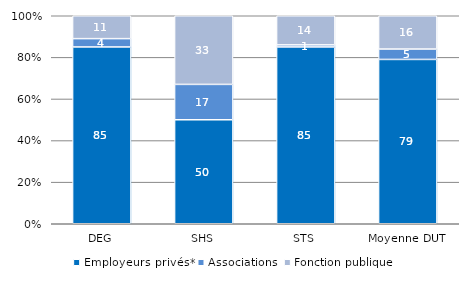
| Category | Employeurs privés* | Associations | Fonction publique |
|---|---|---|---|
| DEG | 85 | 4 | 11 |
| SHS | 50 | 17 | 33 |
| STS | 85 | 1 | 14 |
| Moyenne DUT | 79 | 5 | 16 |